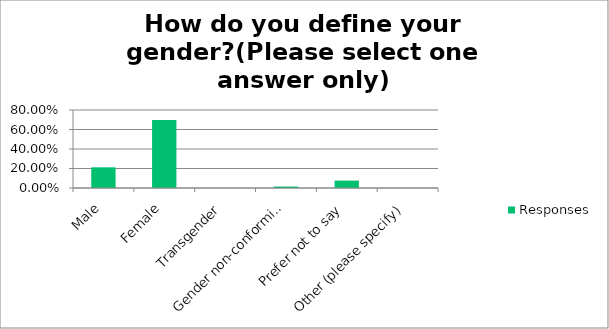
| Category | Responses |
|---|---|
| Male | 0.212 |
| Female | 0.697 |
| Transgender | 0 |
| Gender non-conforming | 0.015 |
| Prefer not to say | 0.076 |
| Other (please specify) | 0 |